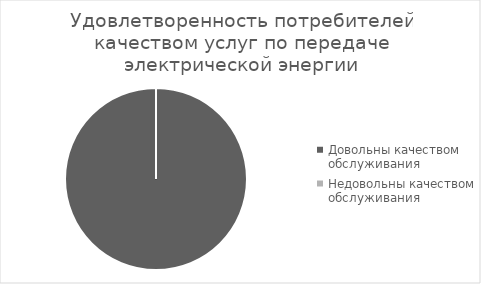
| Category | Удовлетворенность потребителей качеством услуг по передаче электрической энергии |
|---|---|
| Довольны качеством обслуживания | 100 |
| Недовольны качеством обслуживания | 0 |